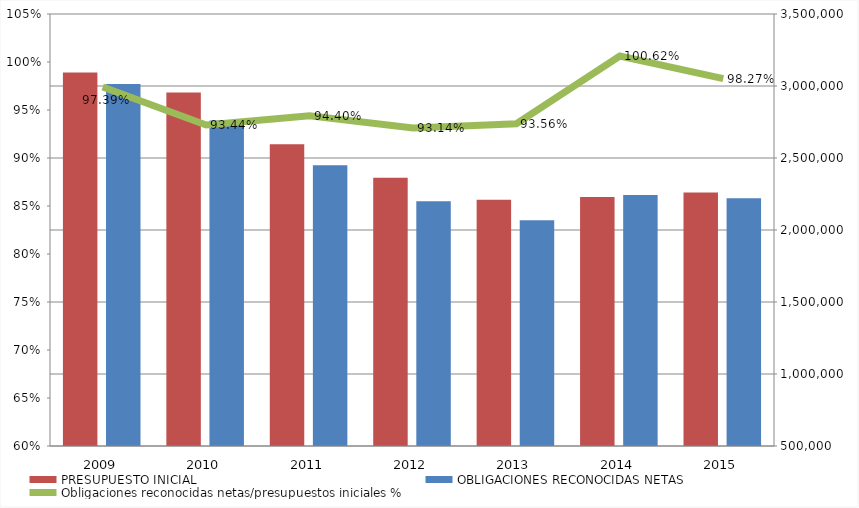
| Category | PRESUPUESTO INICIAL | OBLIGACIONES RECONOCIDAS NETAS |
|---|---|---|
| 2009.0 | 3093843.317 | 3013196.1 |
| 2010.0 | 2954216.153 | 2760471.816 |
| 2011.0 | 2594698.339 | 2449416.224 |
| 2012.0 | 2362389.293 | 2200272.47 |
| 2013.0 | 2209300.484 | 2067080.929 |
| 2014.0 | 2230001.37 | 2243846.616 |
| 2015.0 | 2260019.423 | 2220814.271 |